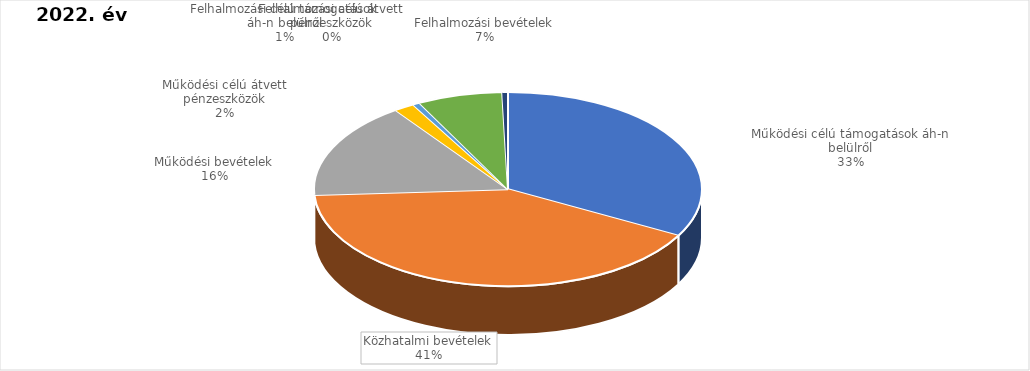
| Category | Series 0 |
|---|---|
| Működési célú támogatások áh-n belülről | 10535311000 |
| Közhatalmi bevételek | 13141185000 |
| Működési bevételek | 5143814000 |
| Működési célú átvett pénzeszközök | 547063000 |
| Felhalmozási célú támogatások áh-n belülről | 188205000 |
| Felhalmozási bevételek | 2264681000 |
| Felhalmozási célú átvett pénzeszközök | 153000000 |